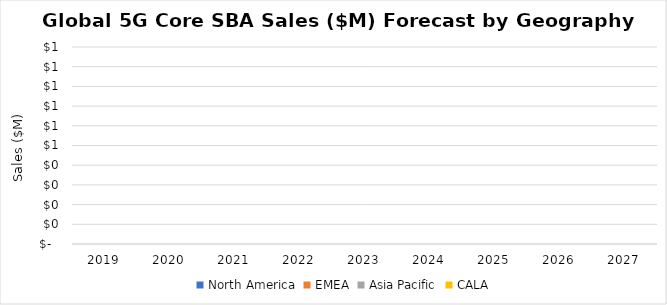
| Category | North America | EMEA | Asia Pacific | CALA |
|---|---|---|---|---|
| 2019.0 | 0 | 0 | 0 | 0 |
| 2020.0 | 0 | 0 | 0 | 0 |
| 2021.0 | 0 | 0 | 0 | 0 |
| 2022.0 | 0 | 0 | 0 | 0 |
| 2023.0 | 0 | 0 | 0 | 0 |
| 2024.0 | 0 | 0 | 0 | 0 |
| 2025.0 | 0 | 0 | 0 | 0 |
| 2026.0 | 0 | 0 | 0 | 0 |
| 2027.0 | 0 | 0 | 0 | 0 |